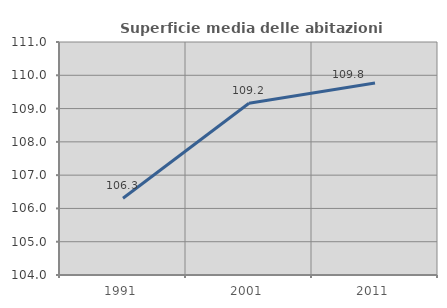
| Category | Superficie media delle abitazioni occupate |
|---|---|
| 1991.0 | 106.307 |
| 2001.0 | 109.16 |
| 2011.0 | 109.77 |